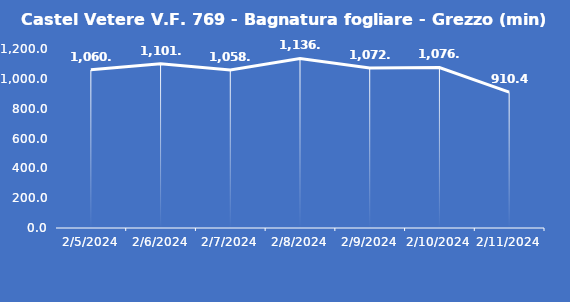
| Category | Castel Vetere V.F. 769 - Bagnatura fogliare - Grezzo (min) |
|---|---|
| 2/5/24 | 1060.6 |
| 2/6/24 | 1101 |
| 2/7/24 | 1058.7 |
| 2/8/24 | 1136.8 |
| 2/9/24 | 1072.3 |
| 2/10/24 | 1076 |
| 2/11/24 | 910.4 |